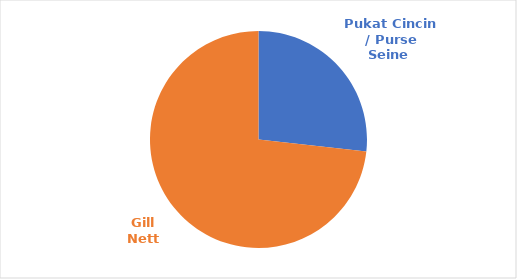
| Category | Series 0 |
|---|---|
| Pukat Cincin / Purse Seine  | 190 |
| Gill Nett | 520 |